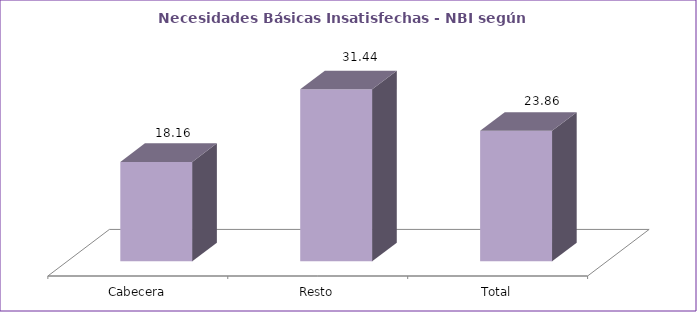
| Category | Series 0 |
|---|---|
| Cabecera | 18.16 |
| Resto | 31.44 |
| Total | 23.86 |